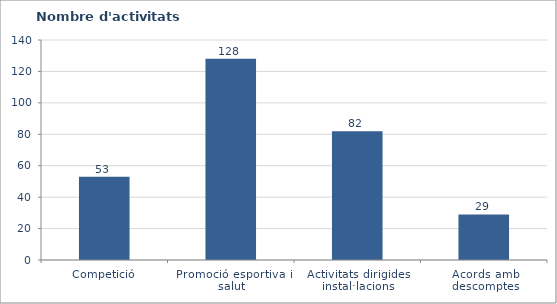
| Category | Nombre d'activitats ofertades |
|---|---|
| Competició | 53 |
| Promoció esportiva i salut | 128 |
| Activitats dirigides instal·lacions | 82 |
| Acords amb descomptes | 29 |